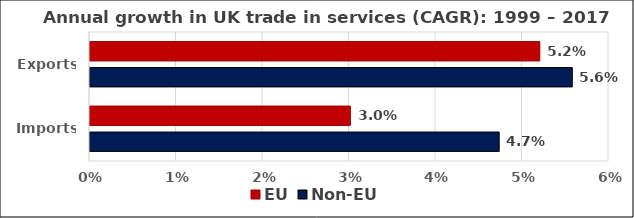
| Category | EU | Non-EU  |
|---|---|---|
| Exports  | 0.052 | 0.056 |
| Imports | 0.03 | 0.047 |